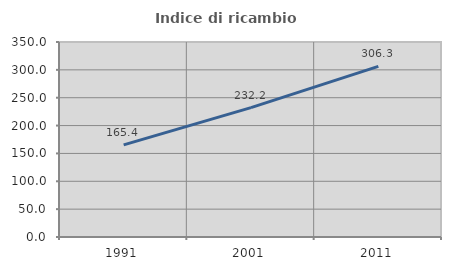
| Category | Indice di ricambio occupazionale  |
|---|---|
| 1991.0 | 165.37 |
| 2001.0 | 232.247 |
| 2011.0 | 306.294 |